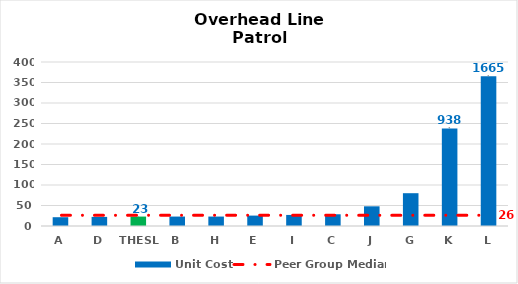
| Category | Unit Cost |
|---|---|
| A | 21.432 |
| D | 22.226 |
| THESL | 23 |
| B | 23.02 |
| H | 23.02 |
| E | 25.401 |
| I | 26.989 |
| C | 28.576 |
| J | 48 |
| G | 80 |
| K | 238 |
| L | 365 |